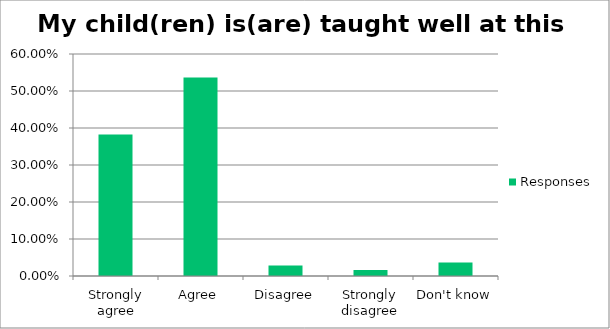
| Category | Responses |
|---|---|
| Strongly agree | 0.382 |
| Agree | 0.537 |
| Disagree | 0.028 |
| Strongly disagree | 0.016 |
| Don't know | 0.037 |